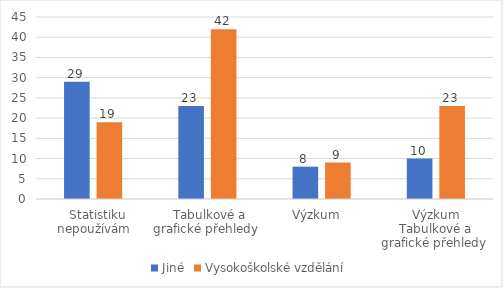
| Category | Jiné | Vysokoškolské vzdělání |
|---|---|---|
|   Statistiku nepoužívám | 29 | 19 |
|  Tabulkové a grafické přehledy  | 23 | 42 |
| Výzkum   | 8 | 9 |
| Výzkum Tabulkové a grafické přehledy  | 10 | 23 |